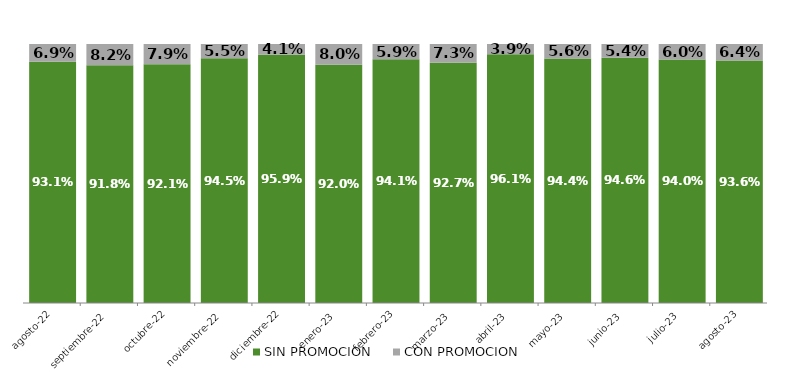
| Category | SIN PROMOCION   | CON PROMOCION   |
|---|---|---|
| 2022-08-01 | 0.931 | 0.069 |
| 2022-09-01 | 0.918 | 0.082 |
| 2022-10-01 | 0.921 | 0.079 |
| 2022-11-01 | 0.945 | 0.055 |
| 2022-12-01 | 0.959 | 0.041 |
| 2023-01-01 | 0.92 | 0.08 |
| 2023-02-01 | 0.941 | 0.059 |
| 2023-03-01 | 0.927 | 0.073 |
| 2023-04-01 | 0.961 | 0.039 |
| 2023-05-01 | 0.944 | 0.056 |
| 2023-06-01 | 0.946 | 0.054 |
| 2023-07-01 | 0.94 | 0.06 |
| 2023-08-01 | 0.936 | 0.064 |